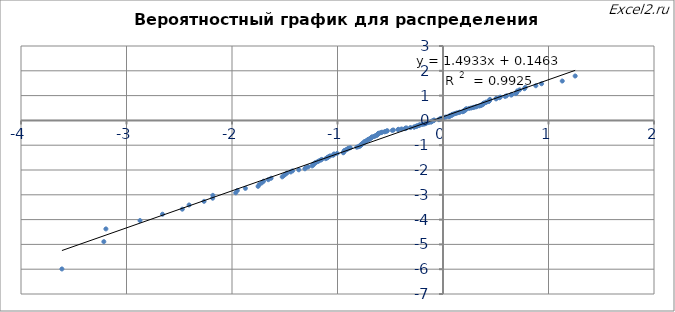
| Category | ln (Массив сорт) |
|---|---|
| -3.6122269181664164 | -5.99 |
| -3.2148445338872476 | -4.889 |
| -3.1952496358694447 | -4.376 |
| -2.8720327964332855 | -4.037 |
| -2.6589471186199107 | -3.783 |
| -2.4709282120586855 | -3.58 |
| -2.4066715122043565 | -3.41 |
| -2.2648334167281736 | -3.264 |
| -2.18322016071799 | -3.137 |
| -2.1813974880489226 | -3.023 |
| -1.9646013684604882 | -2.92 |
| -1.9493419051743666 | -2.827 |
| -1.872849433639919 | -2.74 |
| -1.7529519063143466 | -2.661 |
| -1.741358139470079 | -2.587 |
| -1.7171718526055353 | -2.517 |
| -1.700603038145941 | -2.452 |
| -1.6558951058203912 | -2.391 |
| -1.6292614725402905 | -2.332 |
| -1.52375453929775 | -2.277 |
| -1.5085033636109693 | -2.224 |
| -1.4949798754733181 | -2.174 |
| -1.4796310810005724 | -2.126 |
| -1.4437802447338308 | -2.079 |
| -1.425943355371433 | -2.035 |
| -1.3668845554949773 | -1.992 |
| -1.3091081004402825 | -1.951 |
| -1.3005353872885728 | -1.911 |
| -1.2777855856977296 | -1.873 |
| -1.2406084964316801 | -1.835 |
| -1.2298269981288406 | -1.799 |
| -1.229711747546897 | -1.764 |
| -1.2141039146072083 | -1.73 |
| -1.2074851000208677 | -1.697 |
| -1.187669610747186 | -1.664 |
| -1.1769960524334988 | -1.633 |
| -1.1597211264916778 | -1.602 |
| -1.1486634207224 | -1.572 |
| -1.1115694651642622 | -1.543 |
| -1.0975957901493807 | -1.514 |
| -1.0933206381482732 | -1.486 |
| -1.0813447184593918 | -1.459 |
| -1.0706151335065346 | -1.432 |
| -1.04178857037147 | -1.405 |
| -1.0340034159491345 | -1.38 |
| -1.0324672229825673 | -1.354 |
| -1.0033457109859516 | -1.329 |
| -0.9455943684092857 | -1.305 |
| -0.9422721119861466 | -1.281 |
| -0.9385298899907482 | -1.258 |
| -0.9358433433406217 | -1.234 |
| -0.9336720745565278 | -1.212 |
| -0.9202351843457267 | -1.189 |
| -0.9117786210265154 | -1.167 |
| -0.900423363000624 | -1.145 |
| -0.896906348092612 | -1.124 |
| -0.8785988894157578 | -1.103 |
| -0.8173176139695096 | -1.082 |
| -0.802016349811882 | -1.061 |
| -0.7887495296789793 | -1.041 |
| -0.7844415430134417 | -1.021 |
| -0.7841463980732067 | -1.001 |
| -0.7745752248631677 | -0.982 |
| -0.7678975220381995 | -0.962 |
| -0.7630375701396273 | -0.943 |
| -0.7622630591653576 | -0.924 |
| -0.7494358022532446 | -0.906 |
| -0.7486459687042776 | -0.887 |
| -0.7439094080580856 | -0.869 |
| -0.7422292546611267 | -0.851 |
| -0.731658601552895 | -0.833 |
| -0.721979469158713 | -0.816 |
| -0.7174022276519387 | -0.798 |
| -0.710195639984142 | -0.781 |
| -0.7078165562758981 | -0.764 |
| -0.6945457413154468 | -0.747 |
| -0.6916924757905194 | -0.73 |
| -0.6822452045679924 | -0.713 |
| -0.6783172492353493 | -0.696 |
| -0.673990333636284 | -0.68 |
| -0.6711717675656443 | -0.664 |
| -0.6529241962985002 | -0.647 |
| -0.6467759064822816 | -0.631 |
| -0.6372082060537632 | -0.615 |
| -0.6267011264044129 | -0.6 |
| -0.6249167122642078 | -0.584 |
| -0.6210463628154188 | -0.568 |
| -0.6182759671012985 | -0.553 |
| -0.6134357403842875 | -0.537 |
| -0.6120551598741436 | -0.522 |
| -0.6005470793070684 | -0.507 |
| -0.585708382943873 | -0.492 |
| -0.5785199952299563 | -0.477 |
| -0.5537904451220652 | -0.462 |
| -0.5451180348816975 | -0.447 |
| -0.5334571258108686 | -0.432 |
| -0.5276847179608791 | -0.417 |
| -0.48091940197345334 | -0.403 |
| -0.47045867502194083 | -0.388 |
| -0.4265745946308874 | -0.374 |
| -0.4225974785755528 | -0.359 |
| -0.3929151437689669 | -0.345 |
| -0.3588470999629488 | -0.331 |
| -0.35610345621198614 | -0.316 |
| -0.34634225195964335 | -0.302 |
| -0.3081771054056622 | -0.288 |
| -0.27420887532247185 | -0.274 |
| -0.2699992433461123 | -0.26 |
| -0.25338640582599203 | -0.246 |
| -0.2514330903357174 | -0.232 |
| -0.24336415371936979 | -0.218 |
| -0.22780352218689923 | -0.204 |
| -0.22300328718720536 | -0.19 |
| -0.2207667644243619 | -0.177 |
| -0.1966517199282561 | -0.163 |
| -0.18307323090351713 | -0.149 |
| -0.17104225805652404 | -0.135 |
| -0.1652989106302815 | -0.122 |
| -0.16284193586186954 | -0.108 |
| -0.1453675877535233 | -0.094 |
| -0.1313549320142576 | -0.081 |
| -0.11282393180265772 | -0.067 |
| -0.11037380391327792 | -0.053 |
| -0.10513012113509915 | -0.04 |
| -0.10359695646675869 | -0.026 |
| -0.09151375954801438 | -0.013 |
| -0.08544057103705335 | 0.001 |
| -0.0850297902467018 | 0.015 |
| -0.03873861413380914 | 0.028 |
| -0.038268952400335794 | 0.042 |
| -0.030975392115703024 | 0.055 |
| -0.021189972618488147 | 0.069 |
| -0.01915246684794303 | 0.083 |
| -0.0025536731399587592 | 0.096 |
| 0.008545682957810202 | 0.11 |
| 0.012355747080859708 | 0.124 |
| 0.02907499052713209 | 0.137 |
| 0.05642578748985379 | 0.151 |
| 0.061675838892486005 | 0.165 |
| 0.06367001554273762 | 0.179 |
| 0.06472864236440863 | 0.193 |
| 0.08301272513509146 | 0.206 |
| 0.0840749720900256 | 0.22 |
| 0.08427187751127048 | 0.234 |
| 0.09262826978412968 | 0.248 |
| 0.10573753103152327 | 0.262 |
| 0.11648179874208288 | 0.277 |
| 0.12528331783291688 | 0.291 |
| 0.13742872141404117 | 0.305 |
| 0.15359957757616705 | 0.319 |
| 0.15858729168619182 | 0.334 |
| 0.18609488743984914 | 0.348 |
| 0.1928124954515969 | 0.363 |
| 0.19473545956698946 | 0.378 |
| 0.201154814061629 | 0.392 |
| 0.20640960188392365 | 0.407 |
| 0.21394813854645248 | 0.422 |
| 0.21679152604603033 | 0.437 |
| 0.2186069105809997 | 0.453 |
| 0.22256154078914198 | 0.468 |
| 0.24782046180748044 | 0.484 |
| 0.2676416685849716 | 0.499 |
| 0.2843462244192872 | 0.515 |
| 0.2960543370355841 | 0.531 |
| 0.31334970418355673 | 0.547 |
| 0.32007185148215106 | 0.564 |
| 0.344315966509674 | 0.58 |
| 0.357196445934512 | 0.597 |
| 0.364277106456854 | 0.614 |
| 0.36827131068620456 | 0.632 |
| 0.3798704488142473 | 0.649 |
| 0.3799472444594954 | 0.667 |
| 0.3809656208492324 | 0.685 |
| 0.3904311689926086 | 0.704 |
| 0.4078053741838446 | 0.723 |
| 0.410908536438179 | 0.742 |
| 0.43370551864850754 | 0.761 |
| 0.43697794489939484 | 0.782 |
| 0.4383267461174052 | 0.802 |
| 0.4422446637271509 | 0.823 |
| 0.44508356243490477 | 0.845 |
| 0.5028484841899179 | 0.867 |
| 0.5043942396107203 | 0.89 |
| 0.5352926042212547 | 0.914 |
| 0.5434664753196928 | 0.939 |
| 0.5883867016207665 | 0.965 |
| 0.6029880584094232 | 0.992 |
| 0.647248397597813 | 1.02 |
| 0.6519392196198394 | 1.049 |
| 0.6905825708277815 | 1.081 |
| 0.6973757181464437 | 1.114 |
| 0.7007023518649207 | 1.15 |
| 0.7046871057880811 | 1.189 |
| 0.7259806461928071 | 1.232 |
| 0.7722473420639084 | 1.279 |
| 0.7802220373298195 | 1.333 |
| 0.8800500483221331 | 1.398 |
| 0.9343430528372538 | 1.478 |
| 1.1304169259894128 | 1.588 |
| 1.2529467168815716 | 1.79 |